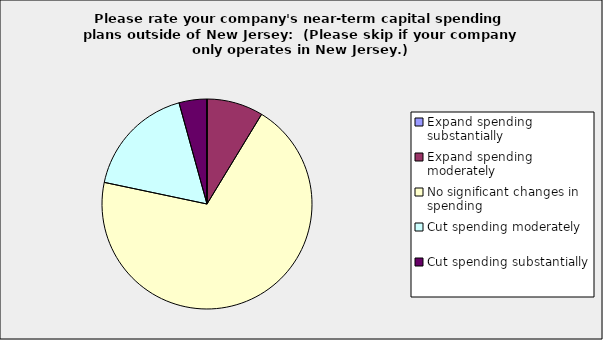
| Category | Series 0 |
|---|---|
| Expand spending substantially | 0 |
| Expand spending moderately | 0.087 |
| No significant changes in spending | 0.696 |
| Cut spending moderately | 0.174 |
| Cut spending substantially | 0.043 |